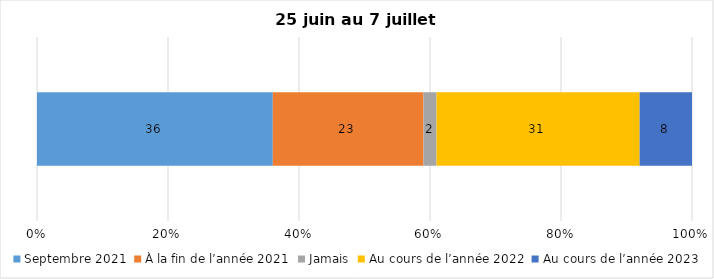
| Category | Septembre 2021 | À la fin de l’année 2021 | Jamais | Au cours de l’année 2022 | Au cours de l’année 2023 |
|---|---|---|---|---|---|
| 0 | 36 | 23 | 2 | 31 | 8 |